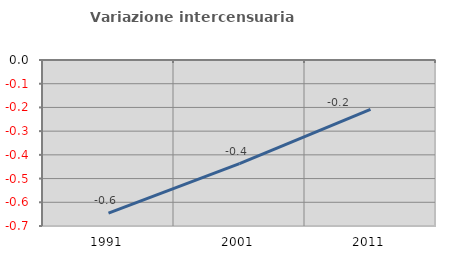
| Category | Variazione intercensuaria annua |
|---|---|
| 1991.0 | -0.645 |
| 2001.0 | -0.437 |
| 2011.0 | -0.208 |